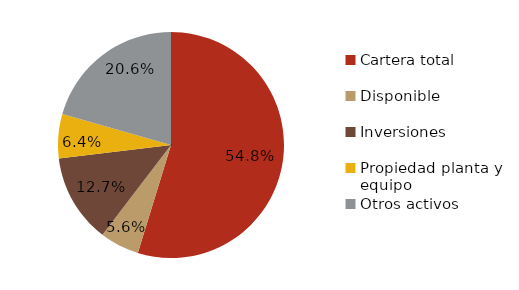
| Category | dic-13 |
|---|---|
| Cartera total | 54.745 |
| Disponible | 5.626 |
| Inversiones | 12.706 |
| Propiedad planta y equipo | 6.337 |
| Otros activos | 20.586 |